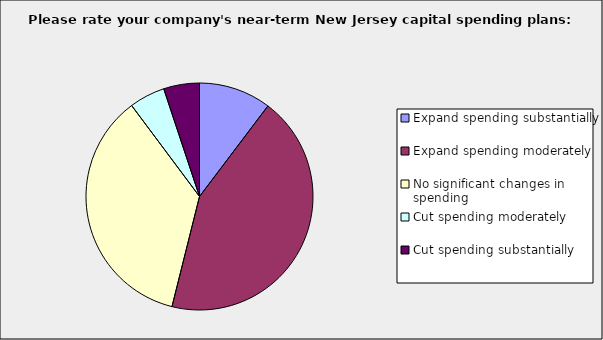
| Category | Series 0 |
|---|---|
| Expand spending substantially | 0.103 |
| Expand spending moderately | 0.436 |
| No significant changes in spending | 0.359 |
| Cut spending moderately | 0.051 |
| Cut spending substantially | 0.051 |